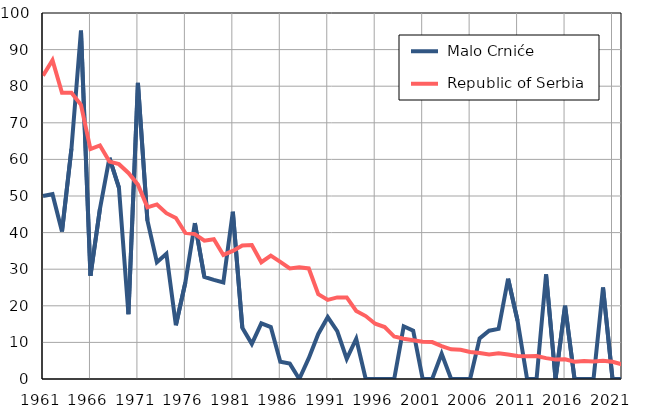
| Category |  Malo Crniće |  Republic of Serbia |
|---|---|---|
| 1961.0 | 50 | 82.9 |
| 1962.0 | 50.5 | 87.1 |
| 1963.0 | 40.3 | 78.2 |
| 1964.0 | 63 | 78.2 |
| 1965.0 | 95.2 | 74.9 |
| 1966.0 | 28.2 | 62.8 |
| 1967.0 | 46.5 | 63.8 |
| 1968.0 | 60.4 | 59.4 |
| 1969.0 | 52.3 | 58.7 |
| 1970.0 | 17.7 | 56.3 |
| 1971.0 | 80.9 | 53.1 |
| 1972.0 | 43.3 | 46.9 |
| 1973.0 | 31.9 | 47.7 |
| 1974.0 | 34.2 | 45.3 |
| 1975.0 | 14.7 | 44 |
| 1976.0 | 26.4 | 39.9 |
| 1977.0 | 42.6 | 39.6 |
| 1978.0 | 27.9 | 37.8 |
| 1979.0 | 27.1 | 38.2 |
| 1980.0 | 26.4 | 33.9 |
| 1981.0 | 45.7 | 35 |
| 1982.0 | 14 | 36.5 |
| 1983.0 | 9.6 | 36.6 |
| 1984.0 | 15.2 | 31.9 |
| 1985.0 | 14.2 | 33.7 |
| 1986.0 | 4.7 | 32 |
| 1987.0 | 4.2 | 30.2 |
| 1988.0 | 0 | 30.5 |
| 1989.0 | 5.7 | 30.2 |
| 1990.0 | 12.3 | 23.2 |
| 1991.0 | 16.9 | 21.6 |
| 1992.0 | 13.1 | 22.3 |
| 1993.0 | 5.5 | 22.3 |
| 1994.0 | 11 | 18.6 |
| 1995.0 | 0 | 17.2 |
| 1996.0 | 0 | 15.1 |
| 1997.0 | 0 | 14.2 |
| 1998.0 | 0 | 11.6 |
| 1999.0 | 14.4 | 11 |
| 2000.0 | 13.2 | 10.6 |
| 2001.0 | 0 | 10.2 |
| 2002.0 | 0 | 10.1 |
| 2003.0 | 6.9 | 9 |
| 2004.0 | 0 | 8.1 |
| 2005.0 | 0 | 8 |
| 2006.0 | 0 | 7.4 |
| 2007.0 | 11.1 | 7.1 |
| 2008.0 | 13.2 | 6.7 |
| 2009.0 | 13.7 | 7 |
| 2010.0 | 27.4 | 6.7 |
| 2011.0 | 15.9 | 6.3 |
| 2012.0 | 0 | 6.2 |
| 2013.0 | 0 | 6.3 |
| 2014.0 | 28.6 | 5.7 |
| 2015.0 | 0 | 5.3 |
| 2016.0 | 20 | 5.4 |
| 2017.0 | 0 | 4.7 |
| 2018.0 | 0 | 4.9 |
| 2019.0 | 0 | 4.8 |
| 2020.0 | 25 | 5 |
| 2021.0 | 0 | 4.7 |
| 2022.0 | 0 | 4 |